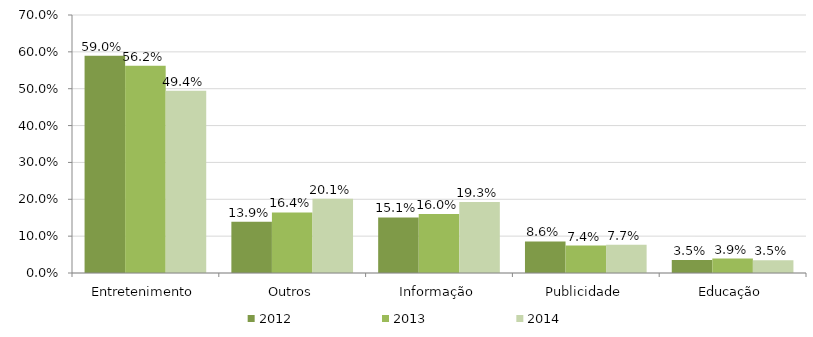
| Category | 2012 | 2013 | 2014 |
|---|---|---|---|
| Entretenimento | 0.59 | 0.562 | 0.494 |
| Outros | 0.139 | 0.164 | 0.201 |
| Informação | 0.151 | 0.16 | 0.193 |
| Publicidade | 0.086 | 0.074 | 0.077 |
| Educação | 0.035 | 0.039 | 0.035 |